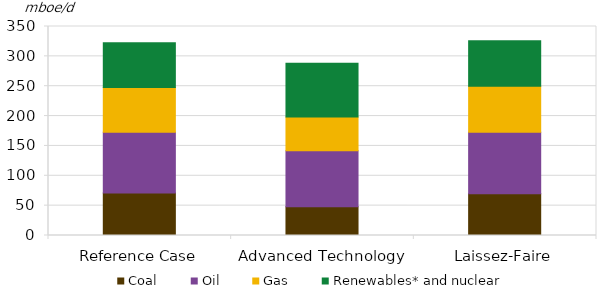
| Category | Coal | Oil | Gas | Renewables* and nuclear |
|---|---|---|---|---|
| Reference Case | 71.057 | 101.983 | 74.972 | 74.881 |
| Advanced Technology | 48.35 | 93.533 | 56.694 | 89.894 |
| Laissez-Faire | 69.968 | 103.113 | 76.671 | 76.433 |